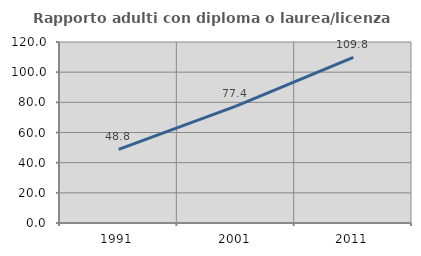
| Category | Rapporto adulti con diploma o laurea/licenza media  |
|---|---|
| 1991.0 | 48.83 |
| 2001.0 | 77.427 |
| 2011.0 | 109.804 |